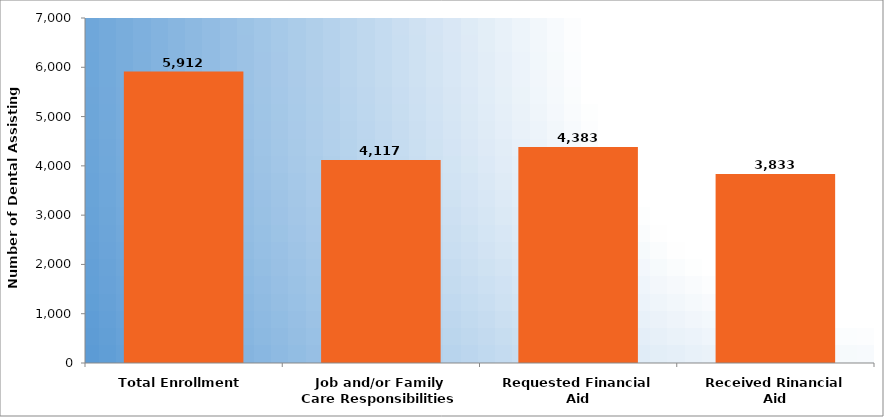
| Category | number of dental assisting students |
|---|---|
| Total Enrollment | 5912 |
| Job and/or Family Care Responsibilities | 4117 |
| Requested Financial Aid | 4383 |
| Received Rinancial Aid | 3833 |